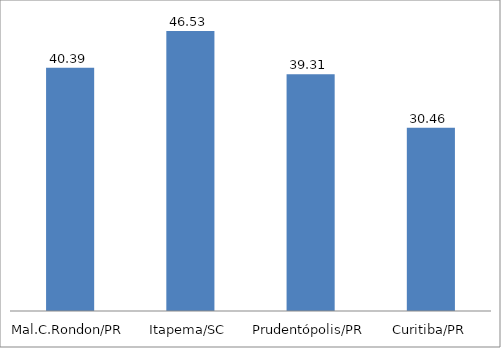
| Category | %LRP |
|---|---|
| Mal.C.Rondon/PR | 40.39 |
| Itapema/SC | 46.53 |
| Prudentópolis/PR | 39.31 |
| Curitiba/PR | 30.46 |